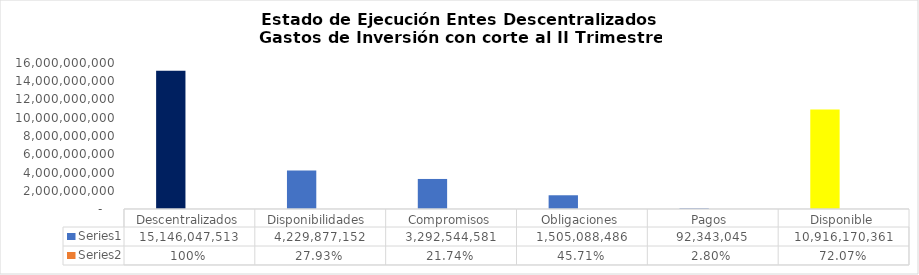
| Category | Series 0 | Series 1 |
|---|---|---|
| Descentralizados | 15146047513.22 | 1 |
| Disponibilidades  | 4229877152.11 | 0.279 |
| Compromisos | 3292544581.33 | 0.217 |
| Obligaciones | 1505088486.27 | 0.457 |
| Pagos  | 92343045.49 | 0.028 |
| Disponible | 10916170361.11 | 0.721 |